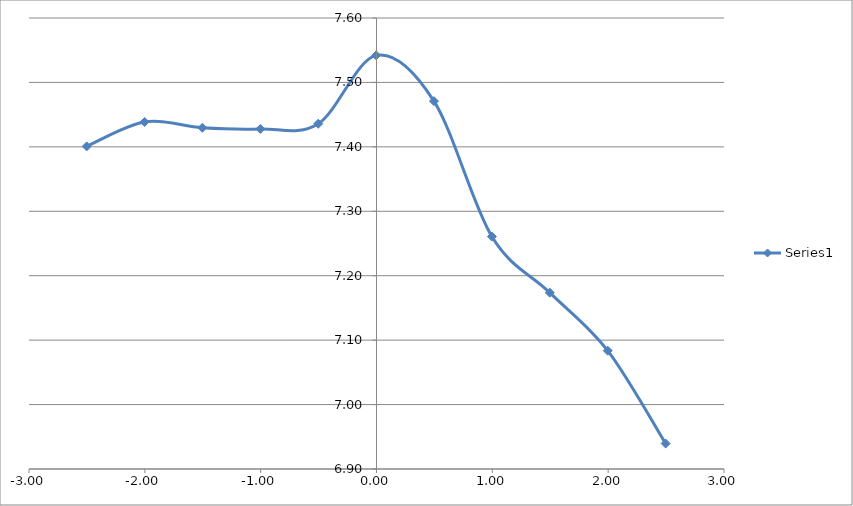
| Category | Series 0 |
|---|---|
| -2.502 | 7.401 |
| -2.002 | 7.439 |
| -1.5030000000000001 | 7.43 |
| -1.0030000000000001 | 7.428 |
| -0.5030000000000001 | 7.436 |
| -0.0030000000000001137 | 7.542 |
| 0.49599999999999955 | 7.471 |
| 0.9959999999999996 | 7.261 |
| 1.4959999999999996 | 7.174 |
| 1.9959999999999996 | 7.084 |
| 2.4959999999999996 | 6.939 |